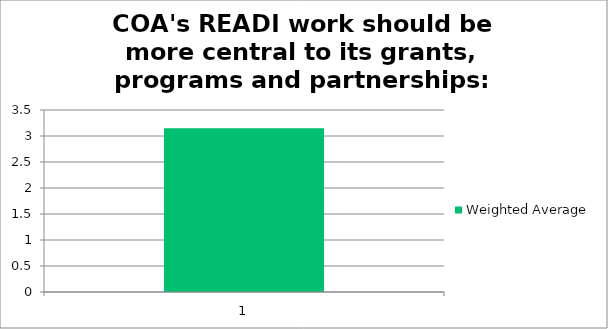
| Category | Weighted Average |
|---|---|
| 1.0 | 3.15 |